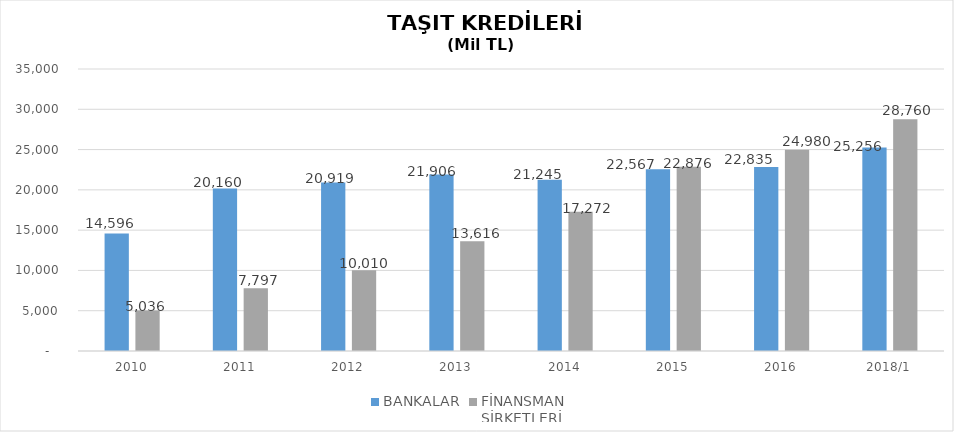
| Category | BANKALAR | FİNANSMAN 
ŞİRKETLERİ |
|---|---|---|
| 2010 | 14596 | 5035.89 |
| 2011 | 20160 | 7796.854 |
| 2012 | 20919 | 10009.755 |
| 2013 | 21906 | 13616.036 |
| 2014 | 21245 | 17271.844 |
| 2015 | 22567 | 22875.563 |
| 2016 | 22835 | 24980.231 |
| 2018/1 | 25256 | 28760.492 |